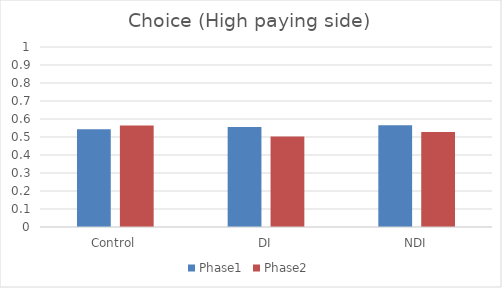
| Category | Phase1 | Phase2 |
|---|---|---|
| Control | 0.543 | 0.564 |
| DI | 0.556 | 0.503 |
| NDI | 0.566 | 0.527 |